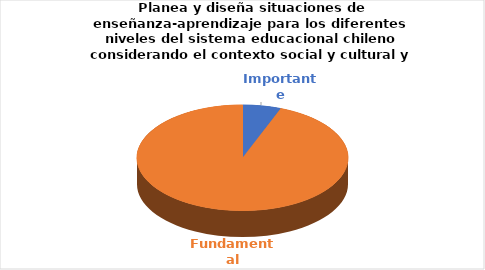
| Category | Series 0 |
|---|---|
| Importante | 1 |
| Fundamental | 16 |